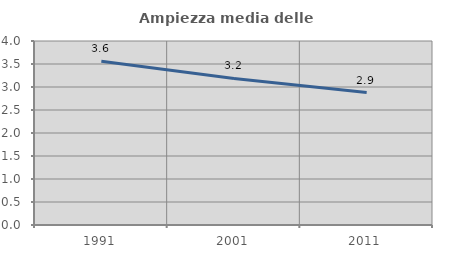
| Category | Ampiezza media delle famiglie |
|---|---|
| 1991.0 | 3.561 |
| 2001.0 | 3.186 |
| 2011.0 | 2.88 |